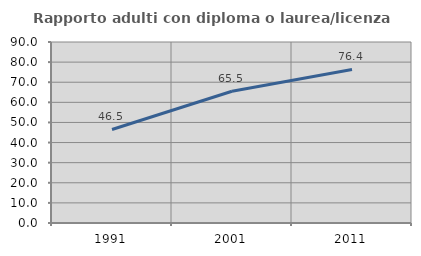
| Category | Rapporto adulti con diploma o laurea/licenza media  |
|---|---|
| 1991.0 | 46.494 |
| 2001.0 | 65.537 |
| 2011.0 | 76.368 |